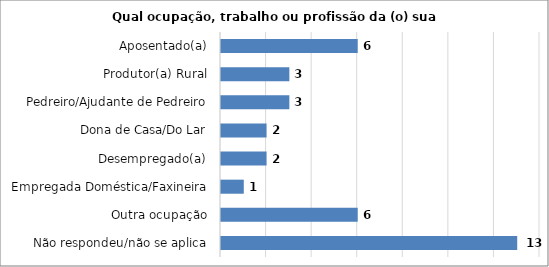
| Category | Series 0 |
|---|---|
| Não respondeu/não se aplica | 13 |
| Outra ocupação | 6 |
| Empregada Doméstica/Faxineira | 1 |
| Desempregado(a) | 2 |
| Dona de Casa/Do Lar | 2 |
| Pedreiro/Ajudante de Pedreiro | 3 |
| Produtor(a) Rural | 3 |
| Aposentado(a) | 6 |